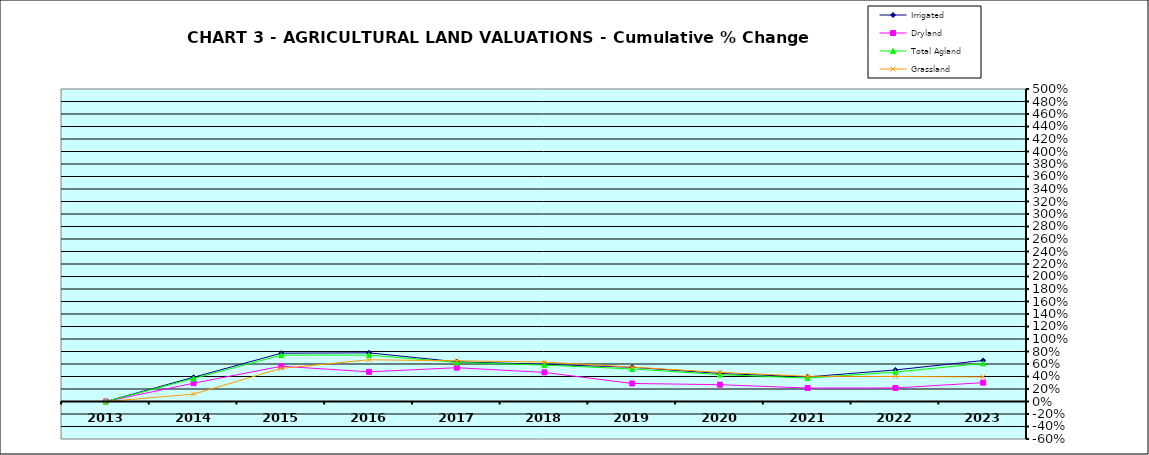
| Category | Irrigated | Dryland | Total Agland | Grassland |
|---|---|---|---|---|
| 2013.0 | 0 | 0 | 0 | 0 |
| 2014.0 | 0.388 | 0.293 | 0.368 | 0.118 |
| 2015.0 | 0.773 | 0.564 | 0.742 | 0.53 |
| 2016.0 | 0.779 | 0.475 | 0.743 | 0.667 |
| 2017.0 | 0.635 | 0.541 | 0.626 | 0.652 |
| 2018.0 | 0.595 | 0.466 | 0.583 | 0.631 |
| 2019.0 | 0.547 | 0.289 | 0.521 | 0.55 |
| 2020.0 | 0.449 | 0.269 | 0.431 | 0.466 |
| 2021.0 | 0.393 | 0.215 | 0.375 | 0.404 |
| 2022.0 | 0.505 | 0.216 | 0.471 | 0.4 |
| 2023.0 | 0.656 | 0.301 | 0.61 | 0.394 |